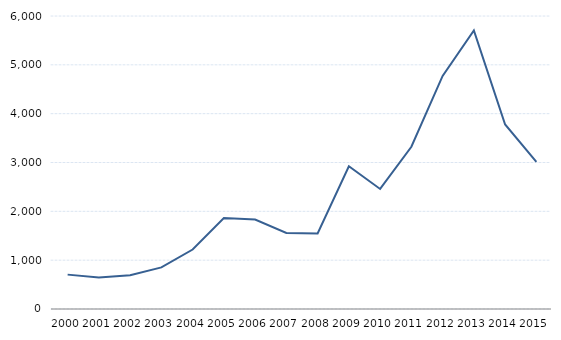
| Category | Series 1 |
|---|---|
| 2000.0 | 704 |
| 2001.0 | 644 |
| 2002.0 | 693 |
| 2003.0 | 852 |
| 2004.0 | 1217 |
| 2005.0 | 1862 |
| 2006.0 | 1831 |
| 2007.0 | 1556 |
| 2008.0 | 1548 |
| 2009.0 | 2922 |
| 2010.0 | 2458 |
| 2011.0 | 3323 |
| 2012.0 | 4774 |
| 2013.0 | 5704 |
| 2014.0 | 3779 |
| 2015.0 | 3013 |